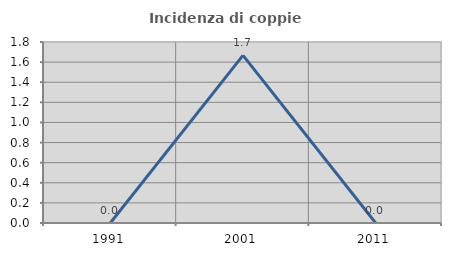
| Category | Incidenza di coppie miste |
|---|---|
| 1991.0 | 0 |
| 2001.0 | 1.667 |
| 2011.0 | 0 |